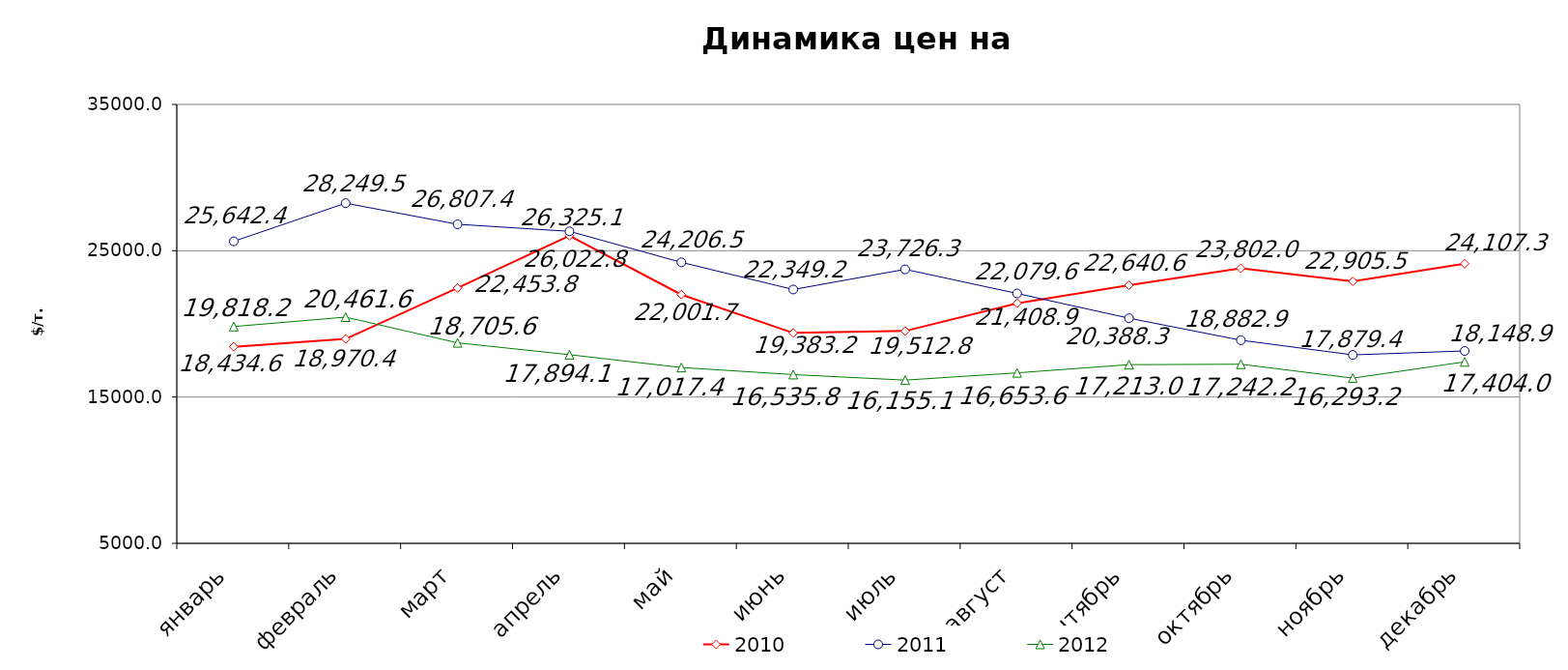
| Category | 2010 | 2011 | 2012 |
|---|---|---|---|
| январь | 18434.625 | 25642.38 | 19818.21 |
| февраль | 18970.375 | 28249.5 | 20461.55 |
| март | 22453.8 | 26807.39 | 18705.57 |
| апрель | 26022.8 | 26325.14 | 17894.079 |
| май | 22001.71 | 24206.5 | 17017.385 |
| июнь | 19383.2 | 22349.21 | 16535.79 |
| июль | 19512.84 | 23726.31 | 16155.1 |
| август | 21408.93 | 22079.55 | 16653.6 |
| сентябрь | 22640.568 | 20388.3 | 17213 |
| октябрь | 23802.02 | 18882.859 | 17242.17 |
| ноябрь | 22905.46 | 17879.44 | 16293.18 |
| декабрь | 24107.26 | 18148.9 | 17403.95 |